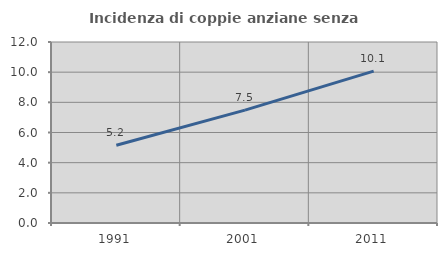
| Category | Incidenza di coppie anziane senza figli  |
|---|---|
| 1991.0 | 5.151 |
| 2001.0 | 7.486 |
| 2011.0 | 10.066 |